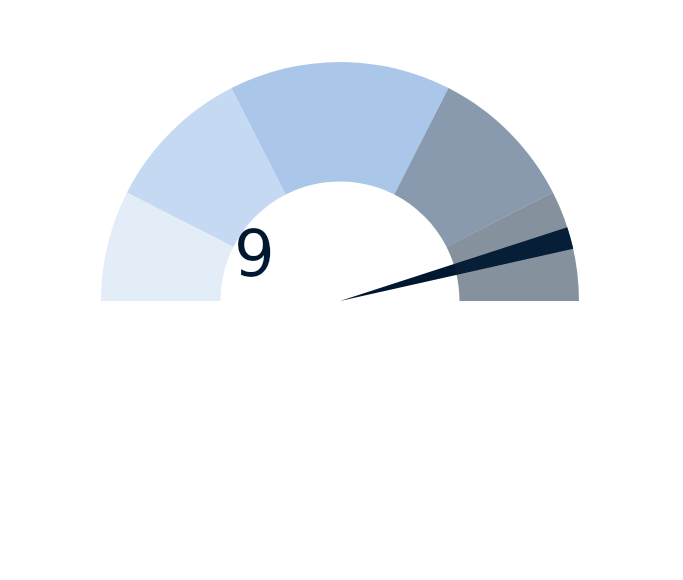
| Category | factor |
|---|---|
| 0 | 9 |
| 1 | 0.3 |
| 2 | 10.7 |